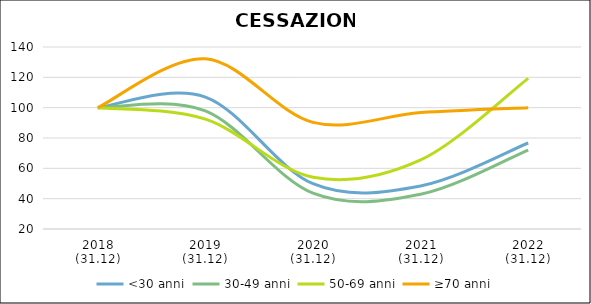
| Category | <30 anni | 30-49 anni | 50-69 anni | ≥70 anni |
|---|---|---|---|---|
| 2018
(31.12) | 100 | 100 | 100 | 100 |
| 2019
(31.12) | 106.979 | 97.836 | 92.424 | 132.258 |
| 2020
(31.12) | 49.856 | 43.602 | 54.104 | 90.323 |
| 2021
(31.12) | 48.405 | 42.915 | 65.517 | 96.774 |
| 2022
(31.12) | 76.705 | 72.068 | 119.33 | 100 |